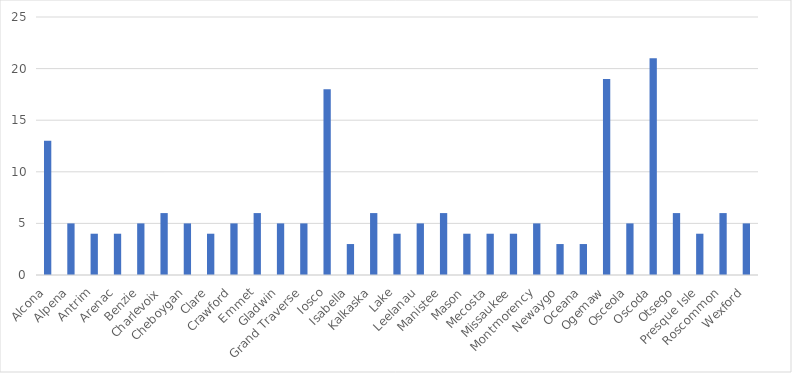
| Category | Number of Responses |
|---|---|
| Alcona | 13 |
| Alpena | 5 |
| Antrim | 4 |
| Arenac | 4 |
| Benzie | 5 |
| Charlevoix | 6 |
| Cheboygan | 5 |
| Clare | 4 |
| Crawford | 5 |
| Emmet | 6 |
| Gladwin | 5 |
| Grand Traverse | 5 |
| Iosco | 18 |
| Isabella | 3 |
| Kalkaska | 6 |
| Lake | 4 |
| Leelanau | 5 |
| Manistee | 6 |
| Mason | 4 |
| Mecosta | 4 |
| Missaukee | 4 |
| Montmorency | 5 |
| Newaygo | 3 |
| Oceana | 3 |
| Ogemaw | 19 |
| Osceola | 5 |
| Oscoda | 21 |
| Otsego | 6 |
| Presque Isle | 4 |
| Roscommon | 6 |
| Wexford | 5 |